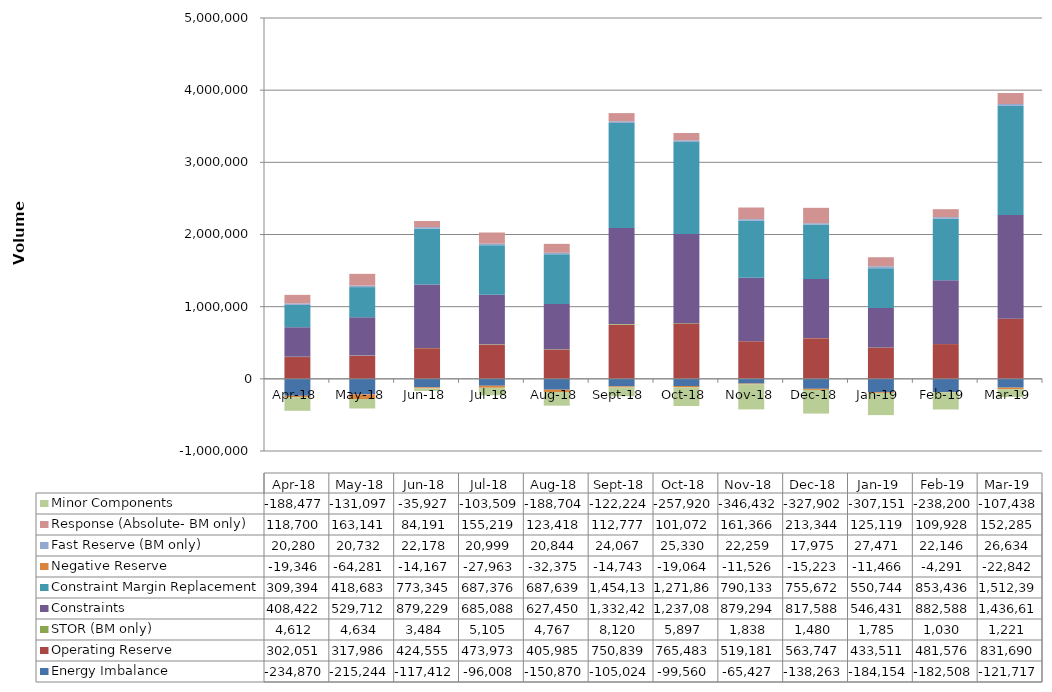
| Category | Energy Imbalance | Operating Reserve | STOR (BM only) | Constraints | Constraint Margin Replacement | Negative Reserve | Fast Reserve (BM only) | Response (Absolute- BM only) | Minor Components |
|---|---|---|---|---|---|---|---|---|---|
| 2018-04-30 | -234870.387 | 302051.17 | 4612.492 | 408422.34 | 309393.579 | -19346.036 | 20279.763 | 118700.29 | -188477.184 |
| 2018-05-31 | -215243.538 | 317985.791 | 4633.733 | 529712.313 | 418683.432 | -64281.02 | 20731.99 | 163141.489 | -131096.994 |
| 2018-06-30 | -117411.796 | 424555.216 | 3483.667 | 879228.553 | 773345.465 | -14166.789 | 22177.568 | 84190.904 | -35927.225 |
| 2018-07-31 | -96007.773 | 473973.196 | 5105.001 | 685088.449 | 687376.395 | -27963.465 | 20998.816 | 155218.766 | -103508.548 |
| 2018-08-31 | -150869.867 | 405985.229 | 4767.332 | 627449.828 | 687639.18 | -32375.289 | 20843.943 | 123418.023 | -188704.201 |
| 2018-09-30 | -105024.459 | 750839.269 | 8120.051 | 1332422.333 | 1454136.497 | -14742.503 | 24067.017 | 112777.446 | -122224.143 |
| 2018-10-31 | -99560.492 | 765483.309 | 5897.409 | 1237083.035 | 1271867.013 | -19064.267 | 25330.426 | 101072.225 | -257919.672 |
| 2018-11-30 | -65426.647 | 519181.381 | 1838.15 | 879293.669 | 790132.552 | -11526.221 | 22259.338 | 161365.801 | -346432.451 |
| 2018-12-31 | -138263.425 | 563746.764 | 1480.166 | 817588.393 | 755671.516 | -15222.544 | 17975.319 | 213343.815 | -327901.558 |
| 2019-01-31 | -184154.07 | 433511.07 | 1784.616 | 546430.896 | 550743.844 | -11466.229 | 27471.206 | 125119.311 | -307150.65 |
| 2019-02-28 | -182507.74 | 481575.565 | 1029.999 | 882588.107 | 853436.107 | -4290.555 | 22145.778 | 109928.339 | -238200.213 |
| 2019-03-31 | -121717.378 | 831689.591 | 1220.599 | 1436612.588 | 1512393.3 | -22842.135 | 26633.761 | 152284.716 | -107438.214 |